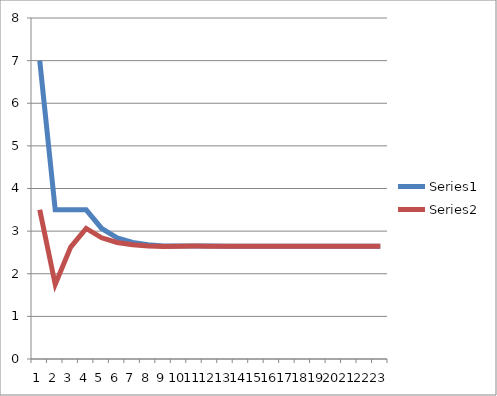
| Category | Series 0 | Series 1 |
|---|---|---|
| 0 | 7 | 3.5 |
| 1 | 3.5 | 1.75 |
| 2 | 3.5 | 2.625 |
| 3 | 3.5 | 3.062 |
| 4 | 3.062 | 2.844 |
| 5 | 2.844 | 2.734 |
| 6 | 2.734 | 2.68 |
| 7 | 2.68 | 2.652 |
| 8 | 2.652 | 2.639 |
| 9 | 2.652 | 2.646 |
| 10 | 2.652 | 2.649 |
| 11 | 2.649 | 2.647 |
| 12 | 2.647 | 2.646 |
| 13 | 2.646 | 2.646 |
| 14 | 2.646 | 2.646 |
| 15 | 2.646 | 2.646 |
| 16 | 2.646 | 2.646 |
| 17 | 2.646 | 2.646 |
| 18 | 2.646 | 2.646 |
| 19 | 2.646 | 2.646 |
| 20 | 2.646 | 2.646 |
| 21 | 2.646 | 2.646 |
| 22 | 2.646 | 2.646 |